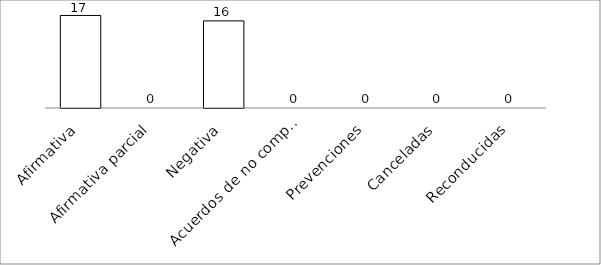
| Category | Series 0 |
|---|---|
| Afirmativa | 17 |
| Afirmativa parcial | 0 |
| Negativa | 16 |
| Acuerdos de no competencia | 0 |
| Prevenciones | 0 |
| Canceladas | 0 |
| Reconducidas | 0 |